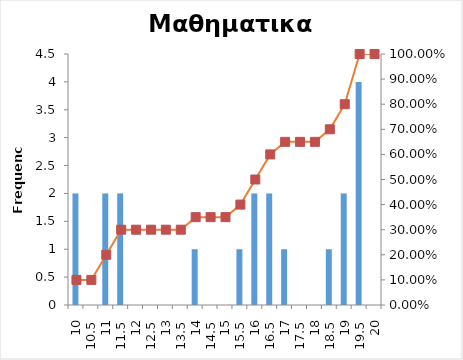
| Category | Series 0 |
|---|---|
| 10 | 2 |
| 10,5 | 0 |
| 11 | 2 |
| 11,5 | 2 |
| 12 | 0 |
| 12,5 | 0 |
| 13 | 0 |
| 13,5 | 0 |
| 14 | 1 |
| 14,5 | 0 |
| 15 | 0 |
| 15,5 | 1 |
| 16 | 2 |
| 16,5 | 2 |
| 17 | 1 |
| 17,5 | 0 |
| 18 | 0 |
| 18,5 | 1 |
| 19 | 2 |
| 19,5 | 4 |
| 20 | 0 |